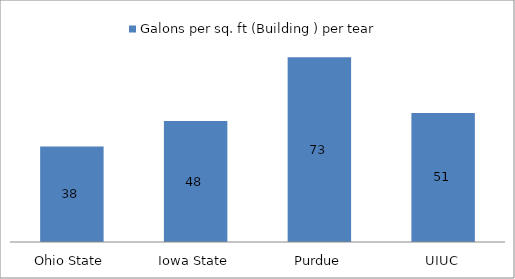
| Category | Galons per sq. ft (Building ) per tear |
|---|---|
| Ohio State | 37.849 |
| Iowa State | 47.895 |
| Purdue | 73.181 |
| UIUC | 51.125 |